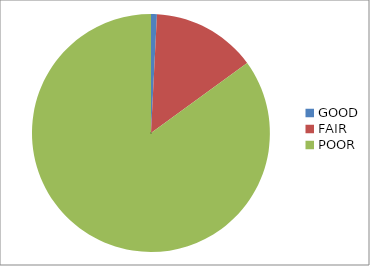
| Category | Series 0 |
|---|---|
| GOOD | 6.12 |
| FAIR | 108.339 |
| POOR | 650.079 |